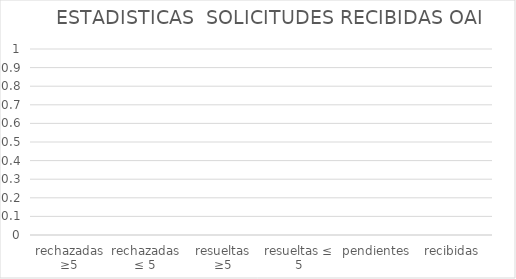
| Category | Series 0 |
|---|---|
| rechazadas ≥5 | 0 |
| rechazadas ≤ 5 | 0 |
| resueltas ≥5 | 0 |
| resueltas ≤ 5 | 0 |
| pendientes | 0 |
| recibidas | 0 |